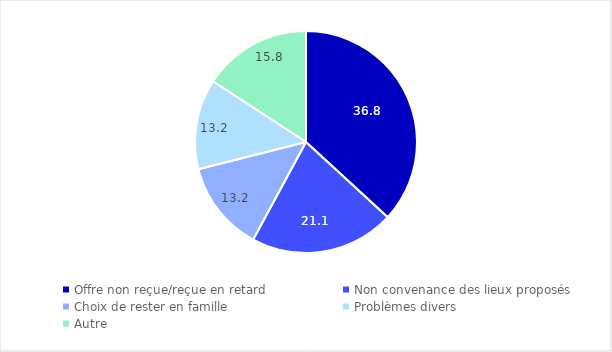
| Category | Series 0 |
|---|---|
| Offre non reçue/reçue en retard | 36.842 |
| Non convenance des lieux proposés | 21.053 |
| Choix de rester en famille | 13.158 |
| Problèmes divers | 13.158 |
| Autre | 15.789 |